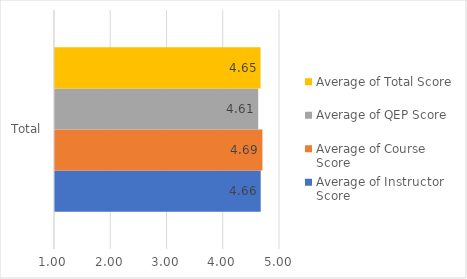
| Category | Average of Instructor Score | Average of Course Score | Average of QEP Score | Average of Total Score |
|---|---|---|---|---|
| Total | 4.657 | 4.687 | 4.612 | 4.655 |